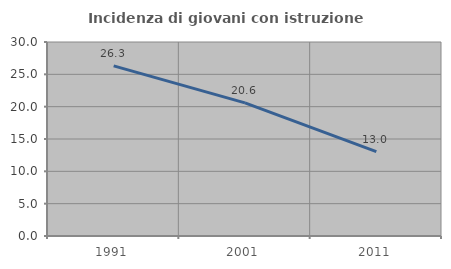
| Category | Incidenza di giovani con istruzione universitaria |
|---|---|
| 1991.0 | 26.316 |
| 2001.0 | 20.588 |
| 2011.0 | 13.043 |